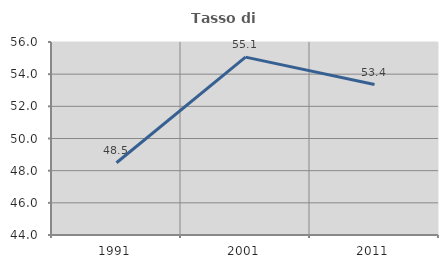
| Category | Tasso di occupazione   |
|---|---|
| 1991.0 | 48.493 |
| 2001.0 | 55.058 |
| 2011.0 | 53.353 |